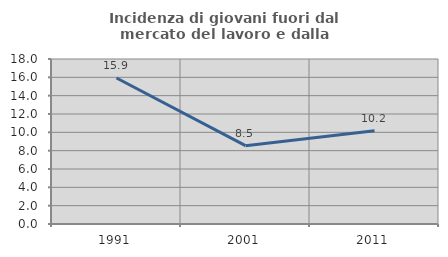
| Category | Incidenza di giovani fuori dal mercato del lavoro e dalla formazione  |
|---|---|
| 1991.0 | 15.926 |
| 2001.0 | 8.543 |
| 2011.0 | 10.185 |